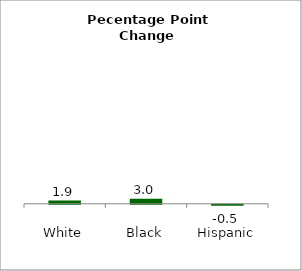
| Category | Series 0 |
|---|---|
| White | 1.941 |
| Black | 2.969 |
| Hispanic | -0.539 |